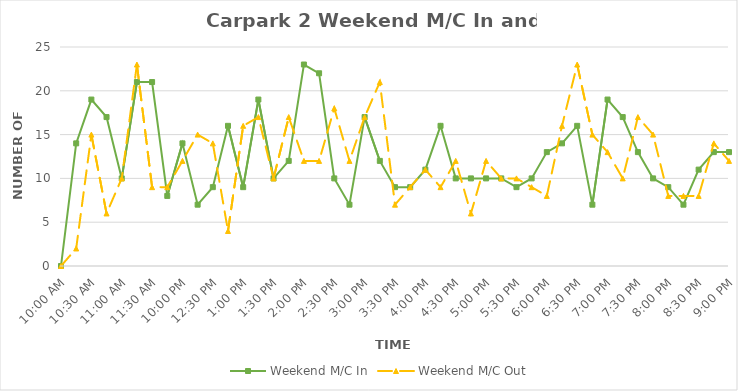
| Category | Weekend M/C In | Weekend M/C Out |
|---|---|---|
| 0.4166666666666667 | 0 | 0 |
| 0.4270833333333333 | 14 | 2 |
| 0.4375 | 19 | 15 |
| 0.4479166666666667 | 17 | 6 |
| 0.4583333333333333 | 10 | 10 |
| 0.46875 | 21 | 23 |
| 0.4791666666666667 | 21 | 9 |
| 0.4895833333333333 | 8 | 9 |
| 0.5 | 14 | 12 |
| 0.5104166666666666 | 7 | 15 |
| 0.5208333333333334 | 9 | 14 |
| 0.53125 | 16 | 4 |
| 0.5416666666666666 | 9 | 16 |
| 0.5520833333333334 | 19 | 17 |
| 0.5625 | 10 | 10 |
| 0.5729166666666666 | 12 | 17 |
| 0.5833333333333334 | 23 | 12 |
| 0.59375 | 22 | 12 |
| 0.604166666666667 | 10 | 18 |
| 0.614583333333334 | 7 | 12 |
| 0.625 | 17 | 17 |
| 0.635416666666667 | 12 | 21 |
| 0.645833333333334 | 9 | 7 |
| 0.656250000000001 | 9 | 9 |
| 0.666666666666667 | 11 | 11 |
| 0.677083333333334 | 16 | 9 |
| 0.687500000000001 | 10 | 12 |
| 0.697916666666668 | 10 | 6 |
| 0.708333333333335 | 10 | 12 |
| 0.718750000000002 | 10 | 10 |
| 0.729166666666669 | 9 | 10 |
| 0.739583333333336 | 10 | 9 |
| 0.75 | 13 | 8 |
| 0.7604166666666666 | 14 | 16 |
| 0.7708333333333334 | 16 | 23 |
| 0.78125 | 7 | 15 |
| 0.7916666666666666 | 19 | 13 |
| 0.8020833333333334 | 17 | 10 |
| 0.8125 | 13 | 17 |
| 0.8229166666666666 | 10 | 15 |
| 0.8333333333333334 | 9 | 8 |
| 0.84375 | 7 | 8 |
| 0.8541666666666666 | 11 | 8 |
| 0.8645833333333334 | 13 | 14 |
| 0.875 | 13 | 12 |